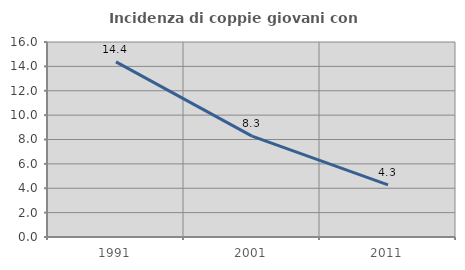
| Category | Incidenza di coppie giovani con figli |
|---|---|
| 1991.0 | 14.369 |
| 2001.0 | 8.275 |
| 2011.0 | 4.275 |